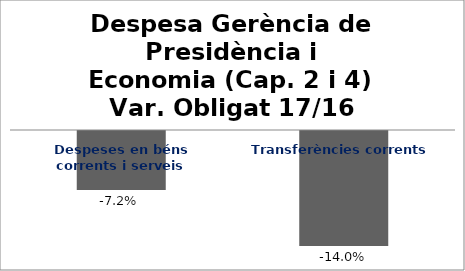
| Category | Series 0 |
|---|---|
| Despeses en béns corrents i serveis | -0.072 |
| Transferències corrents | -0.14 |